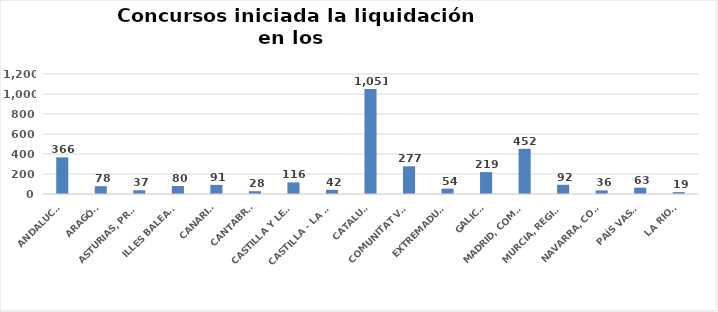
| Category | Series 0 |
|---|---|
| ANDALUCÍA | 366 |
| ARAGÓN | 78 |
| ASTURIAS, PRINCIPADO | 37 |
| ILLES BALEARS | 80 |
| CANARIAS | 91 |
| CANTABRIA | 28 |
| CASTILLA Y LEÓN | 116 |
| CASTILLA - LA MANCHA | 42 |
| CATALUÑA | 1051 |
| COMUNITAT VALENCIANA | 277 |
| EXTREMADURA | 54 |
| GALICIA | 219 |
| MADRID, COMUNIDAD | 452 |
| MURCIA, REGIÓN | 92 |
| NAVARRA, COM. FORAL | 36 |
| PAÍS VASCO | 63 |
| LA RIOJA | 19 |